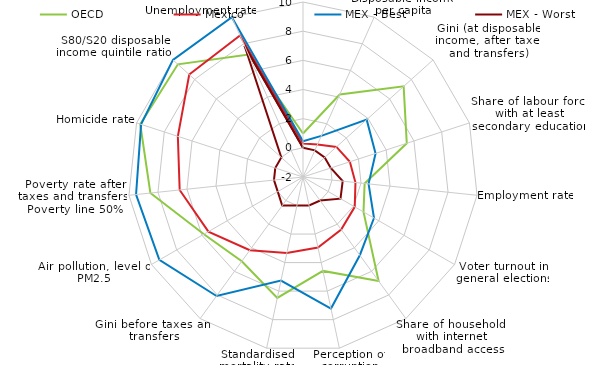
| Category | OECD | Mexico | MEX - Best | MEX - Worst |
|---|---|---|---|---|
| Life expectancy at birth | 0.981 | 0.301 | 0.446 | 0 |
| Disposable income per capita | 4.189 | 0.443 | 1.089 | 0 |
| Gini (at disposable income, after taxes and transfers) | 7.287 | 1.085 | 3.876 | 0 |
| Share of labour force with at least secondary education | 5.481 | 1.379 | 3.232 | 0 |
| Employment rate | 2.248 | 1.616 | 2.521 | 0.736 |
| Voter turnout in general elections | 2.791 | 2.098 | 3.621 | 0.969 |
| Share of households with internet broadband access | 6.819 | 2.457 | 4.629 | 0 |
| Perception of corruption | 4.582 | 2.938 | 7.224 | 0 |
| Standardised mortality rate | 6.481 | 3.333 | 5.263 | 0 |
| Gini before taxes and transfers | 5.141 | 4.202 | 8.085 | 0.426 |
| Air pollution, level of PM2.5 | 5.846 | 5.491 | 9.375 | 0 |
| Poverty rate after taxes and transfers, Poverty line 50% | 8.522 | 6.503 | 9.51 | 0 |
| Homicide rate | 9.735 | 7.023 | 9.674 | 0 |
| S80/S20 disposable income quintile ratio  | 9.545 | 8.498 | 10 | 0 |
| Unemployment rate | 7.196 | 8.623 | 10 | 7.854 |